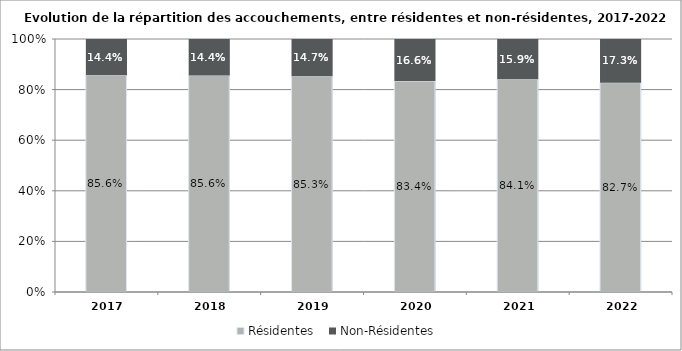
| Category | Résidentes  | Non-Résidentes  |
|---|---|---|
| 2017.0 | 0.856 | 0.144 |
| 2018.0 | 0.856 | 0.144 |
| 2019.0 | 0.853 | 0.147 |
| 2020.0 | 0.834 | 0.166 |
| 2021.0 | 0.841 | 0.159 |
| 2022.0 | 0.827 | 0.173 |